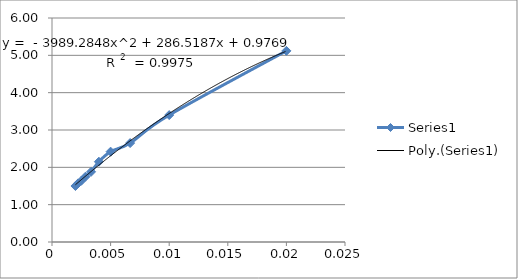
| Category | Series 0 |
|---|---|
| 0.02 | 5.12 |
| 0.01 | 3.4 |
| 0.006666666666666667 | 2.65 |
| 0.005 | 2.42 |
| 0.004 | 2.15 |
| 0.0033333333333333335 | 1.88 |
| 0.002857142857142857 | 1.75 |
| 0.0025 | 1.64 |
| 0.0022222222222222222 | 1.57 |
| 0.002 | 1.5 |